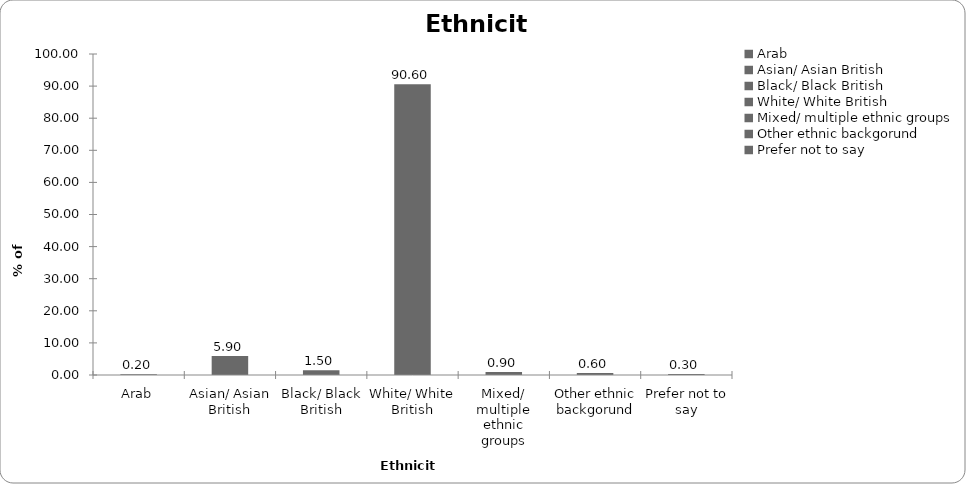
| Category | Ethnicity |
|---|---|
| Arab | 0.2 |
| Asian/ Asian British | 5.9 |
| Black/ Black British | 1.5 |
| White/ White British | 90.6 |
| Mixed/ multiple ethnic groups | 0.9 |
| Other ethnic backgorund | 0.6 |
| Prefer not to say | 0.3 |